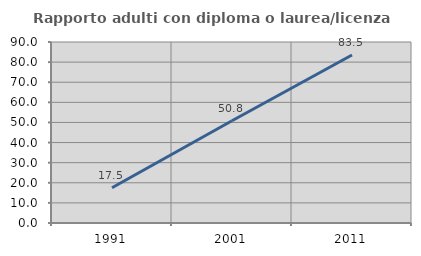
| Category | Rapporto adulti con diploma o laurea/licenza media  |
|---|---|
| 1991.0 | 17.532 |
| 2001.0 | 50.82 |
| 2011.0 | 83.522 |